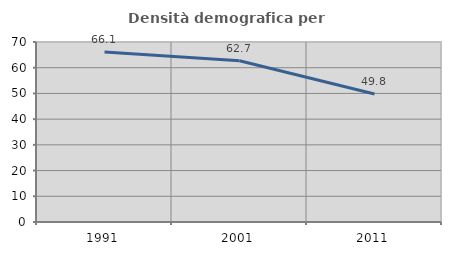
| Category | Densità demografica |
|---|---|
| 1991.0 | 66.134 |
| 2001.0 | 62.702 |
| 2011.0 | 49.766 |